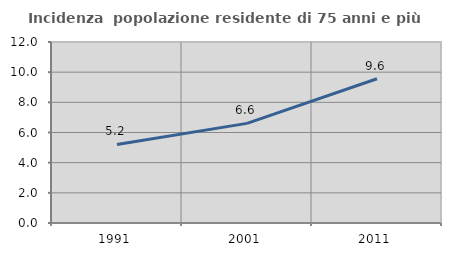
| Category | Incidenza  popolazione residente di 75 anni e più |
|---|---|
| 1991.0 | 5.208 |
| 2001.0 | 6.605 |
| 2011.0 | 9.565 |